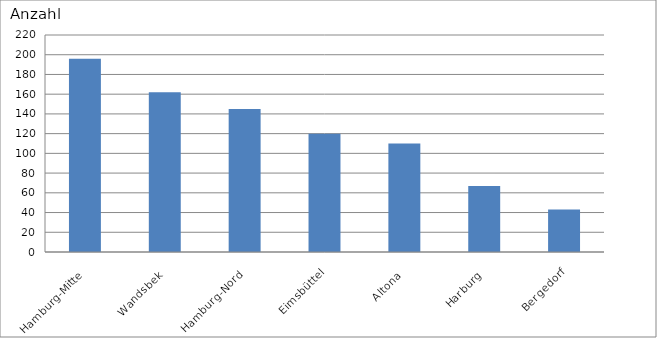
| Category | Hamburg-Mitte Wandsbek Hamburg-Nord Eimsbüttel Altona Harburg Bergedorf |
|---|---|
| Hamburg-Mitte | 196 |
| Wandsbek | 162 |
| Hamburg-Nord | 145 |
| Eimsbüttel | 120 |
| Altona | 110 |
| Harburg | 67 |
| Bergedorf | 43 |